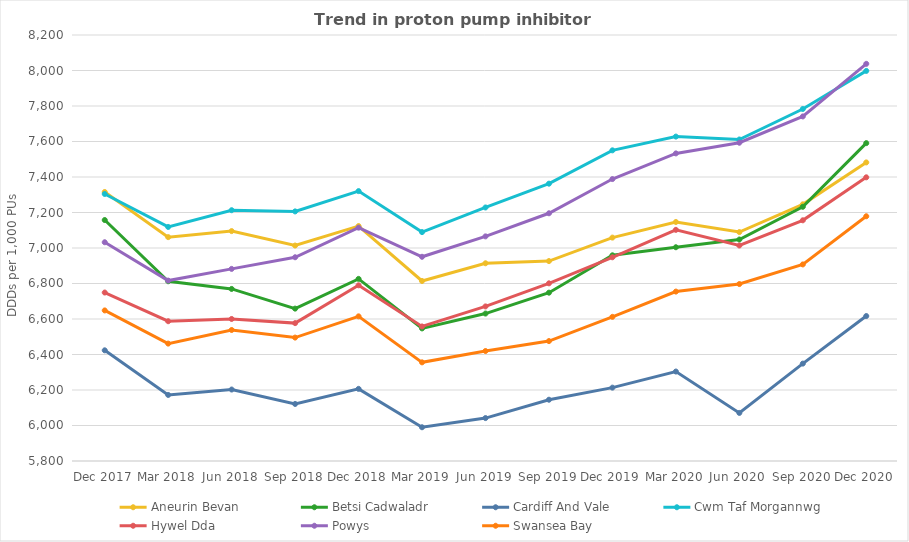
| Category | Aneurin Bevan | Betsi Cadwaladr | Cardiff And Vale | Cwm Taf Morgannwg | Hywel Dda | Powys | Swansea Bay |
|---|---|---|---|---|---|---|---|
| Dec 2017 | 7315.458 | 7157.496 | 6423.538 | 7304.457 | 6749.153 | 7032.415 | 6648.292 |
| Mar 2018 | 7061.21 | 6812.726 | 6172.142 | 7118.599 | 6587.472 | 6816.4 | 6461.384 |
| Jun 2018 | 7095.218 | 6769.362 | 6202.675 | 7212.857 | 6600.161 | 6882.336 | 6538.021 |
| Sep 2018 | 7013.831 | 6658.43 | 6121.405 | 7206.152 | 6576.82 | 6947.844 | 6495.301 |
| Dec 2018 | 7123.596 | 6826.005 | 6206.437 | 7320.532 | 6789.842 | 7114.629 | 6614.958 |
| Mar 2019 | 6814.172 | 6546.967 | 5990.089 | 7089.577 | 6558 | 6950.524 | 6355.799 |
| Jun 2019 | 6913.952 | 6630.699 | 6041.857 | 7228.331 | 6670.904 | 7065.516 | 6419.657 |
| Sep 2019 | 6926.342 | 6748.303 | 6145.244 | 7362.43 | 6800.949 | 7195.582 | 6475.596 |
| Dec 2019 | 7058.605 | 6958.848 | 6213.281 | 7550.221 | 6947.733 | 7388.431 | 6612.092 |
| Mar 2020 | 7146.539 | 7004.265 | 6304.029 | 7627.669 | 7102.255 | 7532.901 | 6754.461 |
| Jun 2020 | 7089.764 | 7047.787 | 6070.842 | 7611.337 | 7014.02 | 7593.001 | 6796.904 |
| Sep 2020 | 7246.031 | 7232.232 | 6348.7 | 7783.195 | 7156.046 | 7741.163 | 6907.415 |
| Dec 2020 | 7482.133 | 7590.825 | 6616.654 | 7997.699 | 7398.225 | 8037.552 | 7178.814 |